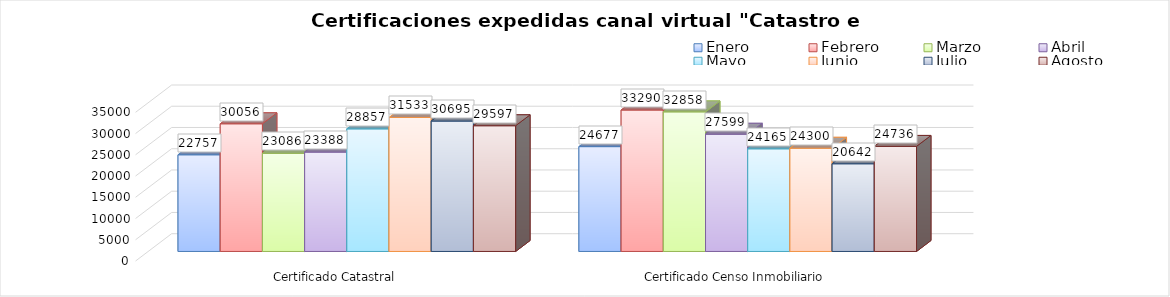
| Category | Enero | Febrero | Marzo | Abril | Mayo | Junio | Julio | Agosto |
|---|---|---|---|---|---|---|---|---|
| Certificado Catastral | 22757 | 30056 | 23086 | 23388 | 28857 | 31533 | 30695 | 29597 |
| Certificado Censo Inmobiliario | 24677 | 33290 | 32858 | 27599 | 24165 | 24300 | 20642 | 24736 |